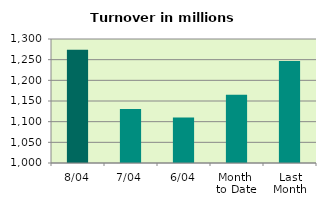
| Category | Series 0 |
|---|---|
| 8/04 | 1273.917 |
| 7/04 | 1130.639 |
| 6/04 | 1109.994 |
| Month 
to Date | 1165.334 |
| Last
Month | 1246.474 |